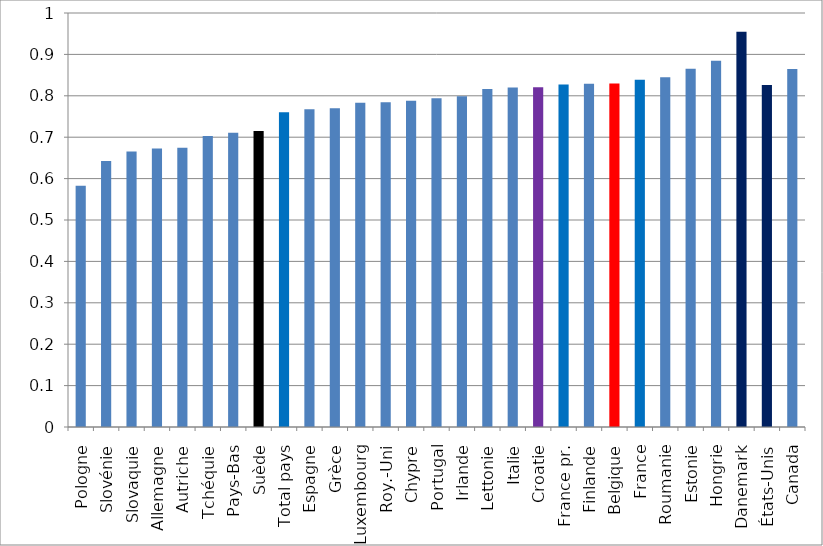
| Category | ratio hors case diagnonale |
|---|---|
| Pologne | 0.583 |
| Slovénie | 0.643 |
| Slovaquie | 0.666 |
| Allemagne | 0.672 |
| Autriche | 0.674 |
| Tchéquie | 0.703 |
| Pays-Bas | 0.711 |
| Suède | 0.715 |
| Total pays | 0.76 |
| Espagne | 0.768 |
| Grèce | 0.77 |
| Luxembourg | 0.783 |
| Roy.-Uni | 0.784 |
| Chypre | 0.788 |
| Portugal | 0.794 |
| Irlande | 0.799 |
| Lettonie | 0.816 |
| Italie | 0.82 |
| Croatie | 0.821 |
| France pr. | 0.827 |
| Finlande | 0.829 |
| Belgique | 0.83 |
| France | 0.839 |
| Roumanie | 0.845 |
| Estonie | 0.865 |
| Hongrie | 0.885 |
| Danemark | 0.955 |
| États-Unis | 0.826 |
| Canada | 0.865 |